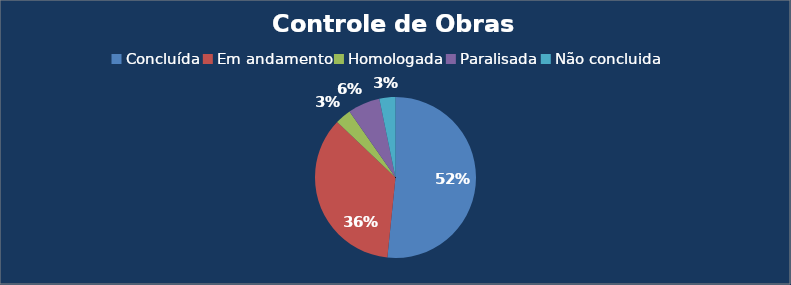
| Category | Contar de Status da Obra     (Homologada, Em Andamento; Concluída; Paralisada e Não Concluída) | Contar de Status da Obra     (Homologada, Em Andamento; Concluída; Paralisada e Não Concluída)2 |
|---|---|---|
| Concluída | 32 | 0.516 |
| Em andamento | 22 | 0.355 |
| Homologada | 2 | 0.032 |
| Paralisada | 4 | 0.065 |
| Não concluida | 2 | 0.032 |